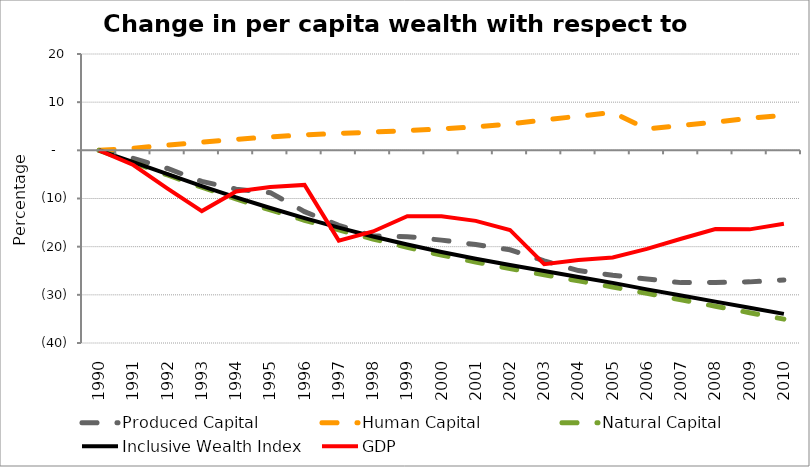
| Category | Produced Capital  | Human Capital | Natural Capital | Inclusive Wealth Index | GDP |
|---|---|---|---|---|---|
| 1990.0 | 0 | 0 | 0 | 0 | 0 |
| 1991.0 | -1.677 | 0.439 | -2.54 | -2.458 | -3.051 |
| 1992.0 | -3.769 | 1.067 | -5.115 | -4.953 | -7.939 |
| 1993.0 | -6.449 | 1.699 | -7.66 | -7.428 | -12.612 |
| 1994.0 | -8.053 | 2.283 | -10.097 | -9.783 | -8.532 |
| 1995.0 | -8.783 | 2.784 | -12.38 | -11.978 | -7.624 |
| 1996.0 | -12.729 | 3.217 | -14.517 | -14.085 | -7.177 |
| 1997.0 | -15.583 | 3.511 | -16.529 | -16.059 | -18.74 |
| 1998.0 | -17.782 | 3.787 | -18.409 | -17.894 | -16.844 |
| 1999.0 | -17.924 | 4.099 | -20.146 | -19.56 | -13.679 |
| 2000.0 | -18.644 | 4.462 | -21.744 | -21.099 | -13.675 |
| 2001.0 | -19.563 | 4.881 | -23.204 | -22.508 | -14.64 |
| 2002.0 | -20.64 | 5.491 | -24.55 | -23.805 | -16.531 |
| 2003.0 | -22.94 | 6.297 | -25.827 | -25.051 | -23.638 |
| 2004.0 | -24.963 | 7.089 | -27.09 | -26.28 | -22.777 |
| 2005.0 | -25.931 | 7.879 | -28.375 | -27.512 | -22.231 |
| 2006.0 | -26.705 | 4.451 | -29.688 | -28.865 | -20.469 |
| 2007.0 | -27.463 | 5.133 | -31.02 | -30.142 | -18.353 |
| 2008.0 | -27.443 | 5.88 | -32.364 | -31.416 | -16.34 |
| 2009.0 | -27.309 | 6.626 | -33.707 | -32.689 | -16.409 |
| 2010.0 | -26.904 | 7.316 | -35.043 | -33.951 | -15.255 |